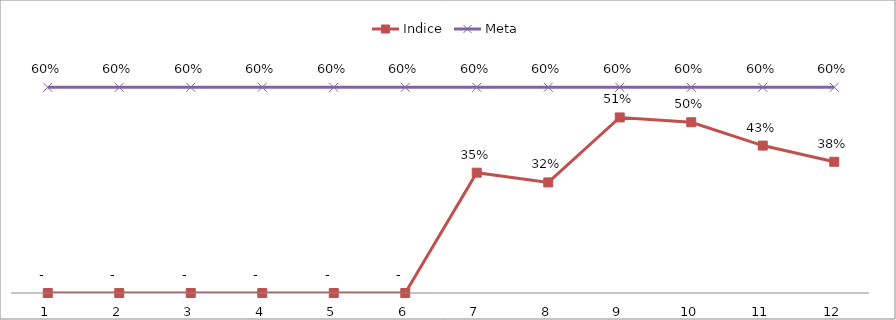
| Category | Indice | Meta |
|---|---|---|
| 0 | 0 | 0.6 |
| 1 | 0 | 0.6 |
| 2 | 0 | 0.6 |
| 3 | 0 | 0.6 |
| 4 | 0 | 0.6 |
| 5 | 0 | 0.6 |
| 6 | 0.351 | 0.6 |
| 7 | 0.322 | 0.6 |
| 8 | 0.512 | 0.6 |
| 9 | 0.498 | 0.6 |
| 10 | 0.43 | 0.6 |
| 11 | 0.383 | 0.6 |